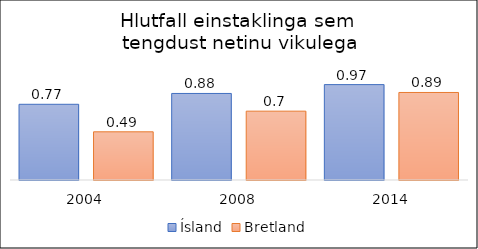
| Category | Ísland | Bretland |
|---|---|---|
| 2004 | 0.77 | 0.49 |
| 2008 | 0.88 | 0.7 |
| 2014 | 0.97 | 0.89 |